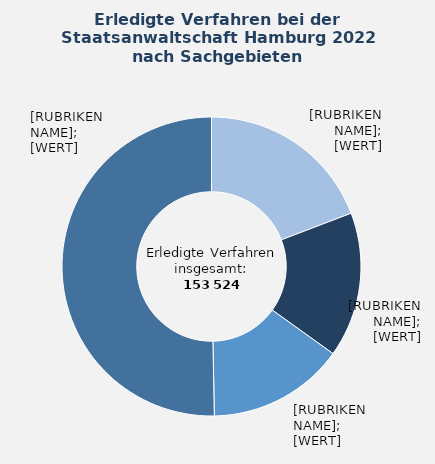
| Category | in Prozent |
|---|---|
| Sonstige allgemeine Straftaten | 19.2 |
| Betrug und Untreue | 15.7 |
| Diebstahl und Unterschlagung | 14.8 |
| Übrige Sachgebiete¹ | 50.3 |